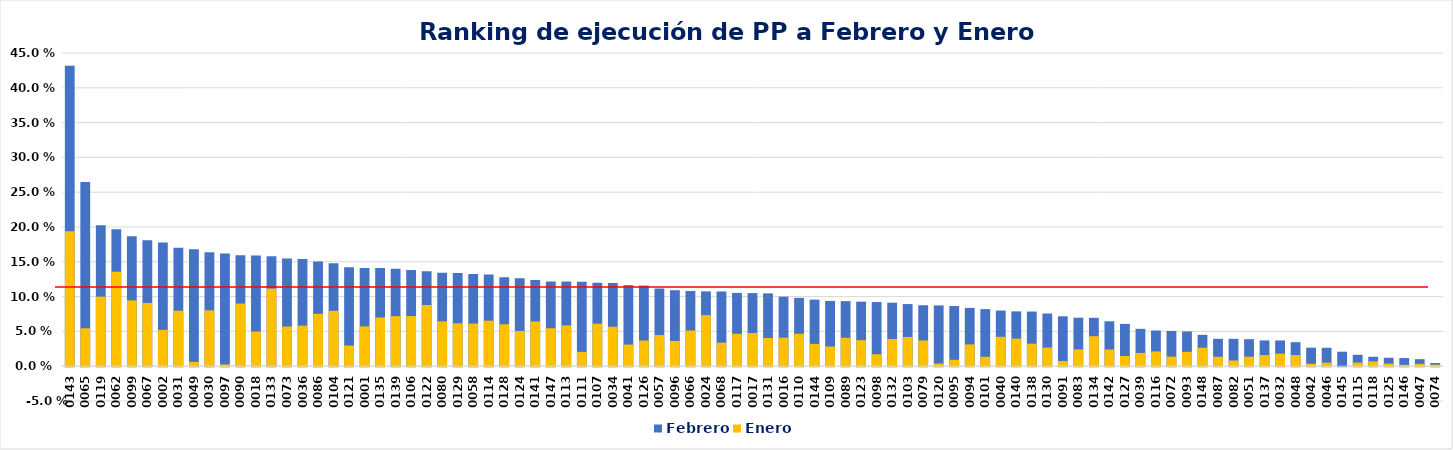
| Category | Febrero | Enero  |
|---|---|---|
| 0143 | 0.432 | 0.194 |
| 0065 | 0.265 | 0.054 |
| 0119 | 0.203 | 0.1 |
| 0062 | 0.197 | 0.136 |
| 0099 | 0.187 | 0.095 |
| 0067 | 0.181 | 0.091 |
| 0002 | 0.178 | 0.052 |
| 0031 | 0.17 | 0.08 |
| 0049 | 0.168 | 0.006 |
| 0030 | 0.164 | 0.08 |
| 0097 | 0.162 | 0.003 |
| 0090 | 0.159 | 0.09 |
| 0018 | 0.159 | 0.05 |
| 0133 | 0.158 | 0.112 |
| 0073 | 0.155 | 0.057 |
| 0036 | 0.154 | 0.058 |
| 0086 | 0.15 | 0.075 |
| 0104 | 0.148 | 0.08 |
| 0121 | 0.142 | 0.03 |
| 0001 | 0.141 | 0.057 |
| 0135 | 0.141 | 0.07 |
| 0139 | 0.14 | 0.072 |
| 0106 | 0.138 | 0.072 |
| 0122 | 0.136 | 0.088 |
| 0080 | 0.134 | 0.064 |
| 0129 | 0.134 | 0.062 |
| 0058 | 0.132 | 0.061 |
| 0114 | 0.132 | 0.065 |
| 0128 | 0.128 | 0.06 |
| 0124 | 0.126 | 0.051 |
| 0141 | 0.124 | 0.064 |
| 0147 | 0.122 | 0.055 |
| 0113 | 0.122 | 0.059 |
| 0111 | 0.121 | 0.021 |
| 0107 | 0.12 | 0.061 |
| 0034 | 0.12 | 0.057 |
| 0041 | 0.116 | 0.031 |
| 0126 | 0.116 | 0.037 |
| 0057 | 0.112 | 0.045 |
| 0096 | 0.109 | 0.036 |
| 0066 | 0.108 | 0.051 |
| 0024 | 0.108 | 0.073 |
| 0068 | 0.107 | 0.034 |
| 0117 | 0.105 | 0.047 |
| 0017 | 0.105 | 0.048 |
| 0131 | 0.105 | 0.041 |
| 0016 | 0.1 | 0.041 |
| 0110 | 0.098 | 0.047 |
| 0144 | 0.096 | 0.032 |
| 0109 | 0.094 | 0.028 |
| 0089 | 0.093 | 0.041 |
| 0123 | 0.093 | 0.037 |
| 0098 | 0.092 | 0.017 |
| 0132 | 0.091 | 0.039 |
| 0103 | 0.089 | 0.042 |
| 0079 | 0.088 | 0.037 |
| 0120 | 0.087 | 0.004 |
| 0095 | 0.086 | 0.009 |
| 0094 | 0.084 | 0.031 |
| 0101 | 0.082 | 0.014 |
| 0040 | 0.08 | 0.042 |
| 0140 | 0.079 | 0.04 |
| 0138 | 0.079 | 0.032 |
| 0130 | 0.076 | 0.027 |
| 0091 | 0.072 | 0.008 |
| 0083 | 0.07 | 0.024 |
| 0134 | 0.07 | 0.043 |
| 0142 | 0.065 | 0.024 |
| 0127 | 0.061 | 0.015 |
| 0039 | 0.054 | 0.019 |
| 0116 | 0.051 | 0.021 |
| 0072 | 0.051 | 0.014 |
| 0093 | 0.05 | 0.021 |
| 0148 | 0.045 | 0.026 |
| 0087 | 0.039 | 0.014 |
| 0082 | 0.039 | 0.008 |
| 0051 | 0.039 | 0.014 |
| 0137 | 0.037 | 0.016 |
| 0032 | 0.037 | 0.018 |
| 0048 | 0.035 | 0.016 |
| 0042 | 0.027 | 0.004 |
| 0046 | 0.026 | 0.005 |
| 0145 | 0.021 | 0 |
| 0115 | 0.016 | 0.005 |
| 0118 | 0.014 | 0.007 |
| 0125 | 0.012 | 0.004 |
| 0146 | 0.012 | 0.002 |
| 0047 | 0.01 | 0.003 |
| 0074 | 0.005 | 0.002 |